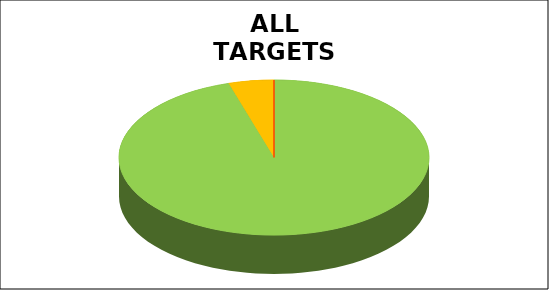
| Category | Series 0 |
|---|---|
| Green | 0.953 |
| Amber | 0.047 |
| Red | 0 |